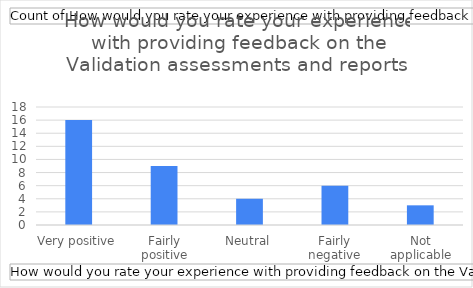
| Category | Total |
|---|---|
| Very positive | 16 |
| Fairly positive | 9 |
| Neutral | 4 |
| Fairly negative | 6 |
| Not applicable | 3 |